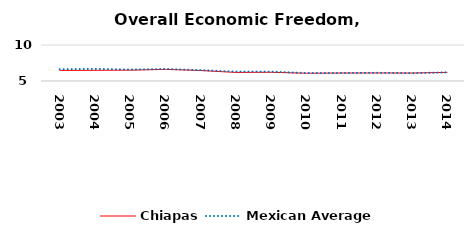
| Category | Chiapas | Mexican Average  |
|---|---|---|
| 2003.0 | 6.468 | 6.632 |
| 2004.0 | 6.483 | 6.678 |
| 2005.0 | 6.504 | 6.582 |
| 2006.0 | 6.617 | 6.668 |
| 2007.0 | 6.452 | 6.508 |
| 2008.0 | 6.188 | 6.3 |
| 2009.0 | 6.211 | 6.3 |
| 2010.0 | 6.077 | 6.105 |
| 2011.0 | 6.112 | 6.103 |
| 2012.0 | 6.116 | 6.144 |
| 2013.0 | 6.11 | 6.087 |
| 2014.0 | 6.198 | 6.195 |